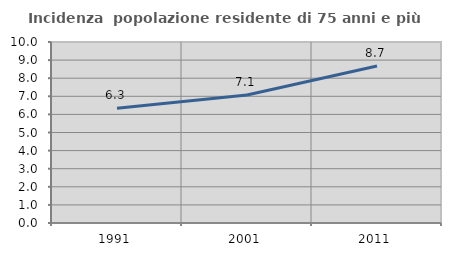
| Category | Incidenza  popolazione residente di 75 anni e più |
|---|---|
| 1991.0 | 6.338 |
| 2001.0 | 7.07 |
| 2011.0 | 8.671 |